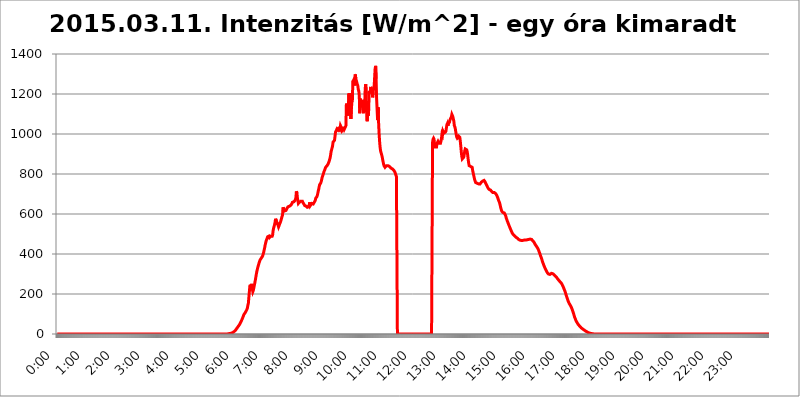
| Category | 2015.03.11. Intenzitás [W/m^2] - egy óra kimaradt |
|---|---|
| 0.0 | -0.256 |
| 0.0006944444444444445 | -0.256 |
| 0.001388888888888889 | -0.256 |
| 0.0020833333333333333 | -0.256 |
| 0.002777777777777778 | -0.256 |
| 0.003472222222222222 | -0.256 |
| 0.004166666666666667 | -0.256 |
| 0.004861111111111111 | -0.256 |
| 0.005555555555555556 | -0.256 |
| 0.0062499999999999995 | -0.256 |
| 0.006944444444444444 | -0.256 |
| 0.007638888888888889 | -0.256 |
| 0.008333333333333333 | -0.256 |
| 0.009027777777777779 | -0.256 |
| 0.009722222222222222 | -0.256 |
| 0.010416666666666666 | -0.256 |
| 0.011111111111111112 | -0.256 |
| 0.011805555555555555 | -0.256 |
| 0.012499999999999999 | -0.256 |
| 0.013194444444444444 | -0.256 |
| 0.013888888888888888 | -0.256 |
| 0.014583333333333332 | -0.256 |
| 0.015277777777777777 | -0.256 |
| 0.015972222222222224 | -0.256 |
| 0.016666666666666666 | -0.256 |
| 0.017361111111111112 | -0.256 |
| 0.018055555555555557 | -0.256 |
| 0.01875 | -0.256 |
| 0.019444444444444445 | -0.256 |
| 0.02013888888888889 | -0.256 |
| 0.020833333333333332 | -0.256 |
| 0.02152777777777778 | -0.256 |
| 0.022222222222222223 | -0.256 |
| 0.02291666666666667 | -0.256 |
| 0.02361111111111111 | -0.256 |
| 0.024305555555555556 | -0.256 |
| 0.024999999999999998 | -0.256 |
| 0.025694444444444447 | -0.256 |
| 0.02638888888888889 | -0.256 |
| 0.027083333333333334 | -0.256 |
| 0.027777777777777776 | -0.256 |
| 0.02847222222222222 | -0.256 |
| 0.029166666666666664 | -0.256 |
| 0.029861111111111113 | -0.256 |
| 0.030555555555555555 | -0.256 |
| 0.03125 | -0.256 |
| 0.03194444444444445 | -0.256 |
| 0.03263888888888889 | -0.256 |
| 0.03333333333333333 | -0.256 |
| 0.034027777777777775 | -0.256 |
| 0.034722222222222224 | -0.256 |
| 0.035416666666666666 | -0.256 |
| 0.036111111111111115 | -0.256 |
| 0.03680555555555556 | -0.256 |
| 0.0375 | -0.256 |
| 0.03819444444444444 | -0.256 |
| 0.03888888888888889 | -0.256 |
| 0.03958333333333333 | -0.256 |
| 0.04027777777777778 | -0.256 |
| 0.04097222222222222 | -0.256 |
| 0.041666666666666664 | -0.256 |
| 0.042361111111111106 | -0.256 |
| 0.04305555555555556 | -0.256 |
| 0.043750000000000004 | -0.256 |
| 0.044444444444444446 | -0.256 |
| 0.04513888888888889 | -0.256 |
| 0.04583333333333334 | -0.256 |
| 0.04652777777777778 | -0.256 |
| 0.04722222222222222 | -0.256 |
| 0.04791666666666666 | -0.256 |
| 0.04861111111111111 | -0.256 |
| 0.049305555555555554 | -0.256 |
| 0.049999999999999996 | -0.256 |
| 0.05069444444444445 | -0.256 |
| 0.051388888888888894 | -0.256 |
| 0.052083333333333336 | -0.256 |
| 0.05277777777777778 | -0.256 |
| 0.05347222222222222 | -0.256 |
| 0.05416666666666667 | -0.256 |
| 0.05486111111111111 | -0.256 |
| 0.05555555555555555 | -0.256 |
| 0.05625 | -0.256 |
| 0.05694444444444444 | -0.256 |
| 0.057638888888888885 | -0.256 |
| 0.05833333333333333 | -0.256 |
| 0.05902777777777778 | -0.256 |
| 0.059722222222222225 | -0.256 |
| 0.06041666666666667 | -0.256 |
| 0.061111111111111116 | -0.256 |
| 0.06180555555555556 | -0.256 |
| 0.0625 | -0.256 |
| 0.06319444444444444 | -0.256 |
| 0.06388888888888888 | -0.256 |
| 0.06458333333333334 | -0.256 |
| 0.06527777777777778 | -0.256 |
| 0.06597222222222222 | -0.256 |
| 0.06666666666666667 | -0.256 |
| 0.06736111111111111 | -0.256 |
| 0.06805555555555555 | -0.256 |
| 0.06874999999999999 | -0.256 |
| 0.06944444444444443 | -0.256 |
| 0.07013888888888889 | -0.256 |
| 0.07083333333333333 | -0.256 |
| 0.07152777777777779 | -0.256 |
| 0.07222222222222223 | -0.256 |
| 0.07291666666666667 | -0.256 |
| 0.07361111111111111 | -0.256 |
| 0.07430555555555556 | -0.256 |
| 0.075 | -0.256 |
| 0.07569444444444444 | -0.256 |
| 0.0763888888888889 | -0.256 |
| 0.07708333333333334 | -0.256 |
| 0.07777777777777778 | -0.256 |
| 0.07847222222222222 | -0.256 |
| 0.07916666666666666 | -0.256 |
| 0.0798611111111111 | -0.256 |
| 0.08055555555555556 | -0.256 |
| 0.08125 | -0.256 |
| 0.08194444444444444 | -0.256 |
| 0.08263888888888889 | -0.256 |
| 0.08333333333333333 | -0.256 |
| 0.08402777777777777 | -0.256 |
| 0.08472222222222221 | -0.256 |
| 0.08541666666666665 | -0.256 |
| 0.08611111111111112 | -0.256 |
| 0.08680555555555557 | -0.256 |
| 0.08750000000000001 | -0.256 |
| 0.08819444444444445 | -0.256 |
| 0.08888888888888889 | -0.256 |
| 0.08958333333333333 | -0.256 |
| 0.09027777777777778 | -0.256 |
| 0.09097222222222222 | -0.256 |
| 0.09166666666666667 | -0.256 |
| 0.09236111111111112 | -0.256 |
| 0.09305555555555556 | -0.256 |
| 0.09375 | -0.256 |
| 0.09444444444444444 | -0.256 |
| 0.09513888888888888 | -0.256 |
| 0.09583333333333333 | -0.256 |
| 0.09652777777777777 | -0.256 |
| 0.09722222222222222 | -0.256 |
| 0.09791666666666667 | -0.256 |
| 0.09861111111111111 | -0.256 |
| 0.09930555555555555 | -0.256 |
| 0.09999999999999999 | -0.256 |
| 0.10069444444444443 | -0.256 |
| 0.1013888888888889 | -0.256 |
| 0.10208333333333335 | -0.256 |
| 0.10277777777777779 | -0.256 |
| 0.10347222222222223 | -0.256 |
| 0.10416666666666667 | -0.256 |
| 0.10486111111111111 | -0.256 |
| 0.10555555555555556 | -0.256 |
| 0.10625 | -0.256 |
| 0.10694444444444444 | -0.256 |
| 0.1076388888888889 | -0.256 |
| 0.10833333333333334 | -0.256 |
| 0.10902777777777778 | -0.256 |
| 0.10972222222222222 | -0.256 |
| 0.1111111111111111 | -0.256 |
| 0.11180555555555556 | -0.256 |
| 0.11180555555555556 | -0.256 |
| 0.1125 | -0.256 |
| 0.11319444444444444 | -0.256 |
| 0.11388888888888889 | -0.256 |
| 0.11458333333333333 | -0.256 |
| 0.11527777777777777 | -0.256 |
| 0.11597222222222221 | -0.256 |
| 0.11666666666666665 | -0.256 |
| 0.1173611111111111 | -0.256 |
| 0.11805555555555557 | -0.256 |
| 0.11944444444444445 | -0.256 |
| 0.12013888888888889 | -0.256 |
| 0.12083333333333333 | -0.256 |
| 0.12152777777777778 | -0.256 |
| 0.12222222222222223 | -0.256 |
| 0.12291666666666667 | -0.256 |
| 0.12291666666666667 | -0.256 |
| 0.12361111111111112 | -0.256 |
| 0.12430555555555556 | -0.256 |
| 0.125 | -0.256 |
| 0.12569444444444444 | -0.256 |
| 0.12638888888888888 | -0.256 |
| 0.12708333333333333 | -0.256 |
| 0.16875 | -0.256 |
| 0.12847222222222224 | -0.256 |
| 0.12916666666666668 | -0.256 |
| 0.12986111111111112 | -0.256 |
| 0.13055555555555556 | -0.256 |
| 0.13125 | -0.256 |
| 0.13194444444444445 | -0.256 |
| 0.1326388888888889 | -0.256 |
| 0.13333333333333333 | -0.256 |
| 0.13402777777777777 | -0.256 |
| 0.13402777777777777 | -0.256 |
| 0.13472222222222222 | -0.256 |
| 0.13541666666666666 | -0.256 |
| 0.1361111111111111 | -0.256 |
| 0.13749999999999998 | -0.256 |
| 0.13819444444444443 | -0.256 |
| 0.1388888888888889 | -0.256 |
| 0.13958333333333334 | -0.256 |
| 0.14027777777777778 | -0.256 |
| 0.14097222222222222 | -0.256 |
| 0.14166666666666666 | -0.256 |
| 0.1423611111111111 | -0.256 |
| 0.14305555555555557 | -0.256 |
| 0.14375000000000002 | -0.256 |
| 0.14444444444444446 | -0.256 |
| 0.1451388888888889 | -0.256 |
| 0.1451388888888889 | -0.256 |
| 0.14652777777777778 | -0.256 |
| 0.14722222222222223 | -0.256 |
| 0.14791666666666667 | -0.256 |
| 0.1486111111111111 | -0.256 |
| 0.14930555555555555 | -0.256 |
| 0.15 | -0.256 |
| 0.15069444444444444 | -0.256 |
| 0.15138888888888888 | -0.256 |
| 0.15208333333333332 | -0.256 |
| 0.15277777777777776 | -0.256 |
| 0.15347222222222223 | -0.256 |
| 0.15416666666666667 | -0.256 |
| 0.15486111111111112 | -0.256 |
| 0.15555555555555556 | -0.256 |
| 0.15625 | -0.256 |
| 0.15694444444444444 | -0.256 |
| 0.15763888888888888 | -0.256 |
| 0.15833333333333333 | -0.256 |
| 0.15902777777777777 | -0.256 |
| 0.15972222222222224 | -0.256 |
| 0.16041666666666668 | -0.256 |
| 0.16111111111111112 | -0.256 |
| 0.16180555555555556 | -0.256 |
| 0.1625 | -0.256 |
| 0.16319444444444445 | -0.256 |
| 0.1638888888888889 | -0.256 |
| 0.16458333333333333 | -0.256 |
| 0.16527777777777777 | -0.256 |
| 0.16597222222222222 | -0.256 |
| 0.16666666666666666 | -0.256 |
| 0.1673611111111111 | -0.256 |
| 0.16805555555555554 | -0.256 |
| 0.16874999999999998 | -0.256 |
| 0.16944444444444443 | -0.256 |
| 0.17013888888888887 | -0.256 |
| 0.1708333333333333 | -0.256 |
| 0.17152777777777775 | -0.256 |
| 0.17222222222222225 | -0.256 |
| 0.1729166666666667 | -0.256 |
| 0.17361111111111113 | -0.256 |
| 0.17430555555555557 | -0.256 |
| 0.17500000000000002 | -0.256 |
| 0.17569444444444446 | -0.256 |
| 0.1763888888888889 | -0.256 |
| 0.17708333333333334 | -0.256 |
| 0.17777777777777778 | -0.256 |
| 0.17847222222222223 | -0.256 |
| 0.17916666666666667 | -0.256 |
| 0.1798611111111111 | -0.256 |
| 0.18055555555555555 | -0.256 |
| 0.18125 | -0.256 |
| 0.18194444444444444 | -0.256 |
| 0.1826388888888889 | -0.256 |
| 0.18333333333333335 | -0.256 |
| 0.1840277777777778 | -0.256 |
| 0.18472222222222223 | -0.256 |
| 0.18541666666666667 | -0.256 |
| 0.18611111111111112 | -0.256 |
| 0.18680555555555556 | -0.256 |
| 0.1875 | -0.256 |
| 0.18819444444444444 | -0.256 |
| 0.18888888888888888 | -0.256 |
| 0.18958333333333333 | -0.256 |
| 0.19027777777777777 | -0.256 |
| 0.1909722222222222 | -0.256 |
| 0.19166666666666665 | -0.256 |
| 0.19236111111111112 | -0.256 |
| 0.19305555555555554 | -0.256 |
| 0.19375 | -0.256 |
| 0.19444444444444445 | -0.256 |
| 0.1951388888888889 | -0.256 |
| 0.19583333333333333 | -0.256 |
| 0.19652777777777777 | -0.256 |
| 0.19722222222222222 | -0.256 |
| 0.19791666666666666 | -0.256 |
| 0.1986111111111111 | -0.256 |
| 0.19930555555555554 | -0.256 |
| 0.19999999999999998 | -0.256 |
| 0.20069444444444443 | -0.256 |
| 0.20138888888888887 | -0.256 |
| 0.2020833333333333 | -0.256 |
| 0.2027777777777778 | -0.256 |
| 0.2034722222222222 | -0.256 |
| 0.2041666666666667 | -0.256 |
| 0.20486111111111113 | -0.256 |
| 0.20555555555555557 | -0.256 |
| 0.20625000000000002 | -0.256 |
| 0.20694444444444446 | -0.256 |
| 0.2076388888888889 | -0.256 |
| 0.20833333333333334 | -0.256 |
| 0.20902777777777778 | -0.256 |
| 0.20972222222222223 | -0.256 |
| 0.21041666666666667 | -0.256 |
| 0.2111111111111111 | -0.256 |
| 0.21180555555555555 | -0.256 |
| 0.2125 | -0.256 |
| 0.21319444444444444 | -0.256 |
| 0.2138888888888889 | -0.256 |
| 0.21458333333333335 | -0.256 |
| 0.2152777777777778 | -0.256 |
| 0.21597222222222223 | -0.256 |
| 0.21666666666666667 | -0.256 |
| 0.21736111111111112 | -0.256 |
| 0.21805555555555556 | -0.256 |
| 0.21875 | -0.256 |
| 0.21944444444444444 | -0.256 |
| 0.22013888888888888 | -0.256 |
| 0.22083333333333333 | -0.256 |
| 0.22152777777777777 | -0.256 |
| 0.2222222222222222 | -0.256 |
| 0.22291666666666665 | -0.256 |
| 0.2236111111111111 | -0.256 |
| 0.22430555555555556 | -0.256 |
| 0.225 | -0.256 |
| 0.22569444444444445 | -0.256 |
| 0.2263888888888889 | -0.256 |
| 0.22708333333333333 | -0.256 |
| 0.22777777777777777 | -0.256 |
| 0.22847222222222222 | -0.256 |
| 0.22916666666666666 | -0.256 |
| 0.2298611111111111 | -0.256 |
| 0.23055555555555554 | -0.256 |
| 0.23124999999999998 | -0.256 |
| 0.23194444444444443 | -0.256 |
| 0.23263888888888887 | -0.256 |
| 0.2333333333333333 | -0.256 |
| 0.2340277777777778 | -0.256 |
| 0.2347222222222222 | -0.256 |
| 0.2354166666666667 | -0.256 |
| 0.23611111111111113 | -0.256 |
| 0.23680555555555557 | -0.256 |
| 0.23750000000000002 | -0.256 |
| 0.23819444444444446 | -0.256 |
| 0.2388888888888889 | -0.256 |
| 0.23958333333333334 | 1.09 |
| 0.24027777777777778 | 1.09 |
| 0.24097222222222223 | 1.09 |
| 0.24166666666666667 | 2.439 |
| 0.2423611111111111 | 2.439 |
| 0.24305555555555555 | 3.791 |
| 0.24375 | 3.791 |
| 0.24444444444444446 | 5.146 |
| 0.24513888888888888 | 6.503 |
| 0.24583333333333335 | 6.503 |
| 0.2465277777777778 | 7.862 |
| 0.24722222222222223 | 9.225 |
| 0.24791666666666667 | 11.956 |
| 0.24861111111111112 | 13.325 |
| 0.24930555555555556 | 16.069 |
| 0.25 | 18.822 |
| 0.25069444444444444 | 22.965 |
| 0.2513888888888889 | 25.736 |
| 0.2520833333333333 | 29.905 |
| 0.25277777777777777 | 32.691 |
| 0.2534722222222222 | 35.483 |
| 0.25416666666666665 | 39.68 |
| 0.2548611111111111 | 42.483 |
| 0.2555555555555556 | 46.695 |
| 0.25625000000000003 | 50.914 |
| 0.2569444444444445 | 56.548 |
| 0.2576388888888889 | 60.778 |
| 0.25833333333333336 | 66.423 |
| 0.2590277777777778 | 72.069 |
| 0.25972222222222224 | 77.715 |
| 0.2604166666666667 | 84.766 |
| 0.2611111111111111 | 90.399 |
| 0.26180555555555557 | 97.427 |
| 0.2625 | 101.634 |
| 0.26319444444444445 | 104.435 |
| 0.2638888888888889 | 108.629 |
| 0.26458333333333334 | 112.814 |
| 0.2652777777777778 | 116.989 |
| 0.2659722222222222 | 122.538 |
| 0.26666666666666666 | 129.444 |
| 0.2673611111111111 | 143.144 |
| 0.26805555555555555 | 153.986 |
| 0.26875 | 183.184 |
| 0.26944444444444443 | 211.405 |
| 0.2701388888888889 | 239.868 |
| 0.2708333333333333 | 245.925 |
| 0.27152777777777776 | 223.906 |
| 0.2722222222222222 | 242.296 |
| 0.27291666666666664 | 250.739 |
| 0.2736111111111111 | 225.146 |
| 0.2743055555555555 | 211.405 |
| 0.27499999999999997 | 217.681 |
| 0.27569444444444446 | 230.083 |
| 0.27638888888888885 | 242.296 |
| 0.27708333333333335 | 255.528 |
| 0.2777777777777778 | 268.576 |
| 0.27847222222222223 | 283.803 |
| 0.2791666666666667 | 297.728 |
| 0.2798611111111111 | 311.594 |
| 0.28055555555555556 | 321.998 |
| 0.28125 | 332.443 |
| 0.28194444444444444 | 341.794 |
| 0.2826388888888889 | 350.049 |
| 0.2833333333333333 | 358.394 |
| 0.28402777777777777 | 365.635 |
| 0.2847222222222222 | 371.742 |
| 0.28541666666666665 | 375.442 |
| 0.28611111111111115 | 379.171 |
| 0.28680555555555554 | 382.93 |
| 0.28750000000000003 | 386.723 |
| 0.2881944444444445 | 391.834 |
| 0.2888888888888889 | 400.943 |
| 0.28958333333333336 | 408.934 |
| 0.2902777777777778 | 421.278 |
| 0.29097222222222224 | 432.656 |
| 0.2916666666666667 | 445.971 |
| 0.2923611111111111 | 456.747 |
| 0.29305555555555557 | 466.302 |
| 0.29375 | 472.848 |
| 0.29444444444444445 | 479.541 |
| 0.2951388888888889 | 486.389 |
| 0.29583333333333334 | 488.126 |
| 0.2965277777777778 | 489.873 |
| 0.2972222222222222 | 489.873 |
| 0.29791666666666666 | 482.945 |
| 0.2986111111111111 | 481.238 |
| 0.29930555555555555 | 488.126 |
| 0.3 | 491.63 |
| 0.30069444444444443 | 488.126 |
| 0.3013888888888889 | 488.126 |
| 0.3020833333333333 | 495.176 |
| 0.30277777777777776 | 517.375 |
| 0.3034722222222222 | 529.108 |
| 0.30416666666666664 | 531.108 |
| 0.3048611111111111 | 547.572 |
| 0.3055555555555555 | 560.495 |
| 0.30624999999999997 | 576.233 |
| 0.3069444444444444 | 564.917 |
| 0.3076388888888889 | 547.572 |
| 0.30833333333333335 | 556.131 |
| 0.3090277777777778 | 553.97 |
| 0.30972222222222223 | 543.376 |
| 0.3104166666666667 | 535.145 |
| 0.3111111111111111 | 541.298 |
| 0.31180555555555556 | 549.691 |
| 0.3125 | 553.97 |
| 0.31319444444444444 | 560.495 |
| 0.3138888888888889 | 569.398 |
| 0.3145833333333333 | 578.542 |
| 0.31527777777777777 | 587.934 |
| 0.3159722222222222 | 595.145 |
| 0.31666666666666665 | 633.495 |
| 0.31736111111111115 | 636.194 |
| 0.31805555555555554 | 620.273 |
| 0.31875000000000003 | 615.11 |
| 0.3194444444444445 | 612.554 |
| 0.3201388888888889 | 615.11 |
| 0.32083333333333336 | 617.682 |
| 0.3215277777777778 | 622.881 |
| 0.32222222222222224 | 628.152 |
| 0.3229166666666667 | 630.814 |
| 0.3236111111111111 | 636.194 |
| 0.32430555555555557 | 638.912 |
| 0.325 | 638.912 |
| 0.32569444444444445 | 638.912 |
| 0.3263888888888889 | 641.649 |
| 0.32708333333333334 | 641.649 |
| 0.3277777777777778 | 644.405 |
| 0.3284722222222222 | 647.179 |
| 0.32916666666666666 | 652.786 |
| 0.3298611111111111 | 658.471 |
| 0.33055555555555555 | 661.343 |
| 0.33125 | 661.343 |
| 0.33194444444444443 | 661.343 |
| 0.3326388888888889 | 664.234 |
| 0.3333333333333333 | 667.146 |
| 0.3340277777777778 | 673.03 |
| 0.3347222222222222 | 682.011 |
| 0.3354166666666667 | 713.328 |
| 0.3361111111111111 | 706.89 |
| 0.3368055555555556 | 682.011 |
| 0.33749999999999997 | 667.146 |
| 0.33819444444444446 | 652.786 |
| 0.33888888888888885 | 655.618 |
| 0.33958333333333335 | 658.471 |
| 0.34027777777777773 | 658.471 |
| 0.34097222222222223 | 661.343 |
| 0.3416666666666666 | 664.234 |
| 0.3423611111111111 | 664.234 |
| 0.3430555555555555 | 664.234 |
| 0.34375 | 664.234 |
| 0.3444444444444445 | 658.471 |
| 0.3451388888888889 | 655.618 |
| 0.3458333333333334 | 649.973 |
| 0.34652777777777777 | 647.179 |
| 0.34722222222222227 | 641.649 |
| 0.34791666666666665 | 638.912 |
| 0.34861111111111115 | 638.912 |
| 0.34930555555555554 | 638.912 |
| 0.35000000000000003 | 636.194 |
| 0.3506944444444444 | 633.495 |
| 0.3513888888888889 | 633.495 |
| 0.3520833333333333 | 633.495 |
| 0.3527777777777778 | 636.194 |
| 0.3534722222222222 | 636.194 |
| 0.3541666666666667 | 658.471 |
| 0.3548611111111111 | 641.649 |
| 0.35555555555555557 | 644.405 |
| 0.35625 | 644.405 |
| 0.35694444444444445 | 652.786 |
| 0.3576388888888889 | 652.786 |
| 0.35833333333333334 | 649.973 |
| 0.3590277777777778 | 649.973 |
| 0.3597222222222222 | 649.973 |
| 0.36041666666666666 | 658.471 |
| 0.3611111111111111 | 658.471 |
| 0.36180555555555555 | 667.146 |
| 0.3625 | 678.997 |
| 0.36319444444444443 | 678.997 |
| 0.3638888888888889 | 685.046 |
| 0.3645833333333333 | 691.18 |
| 0.3652777777777778 | 700.54 |
| 0.3659722222222222 | 713.328 |
| 0.3666666666666667 | 723.153 |
| 0.3673611111111111 | 736.574 |
| 0.3680555555555556 | 746.886 |
| 0.36874999999999997 | 750.371 |
| 0.36944444444444446 | 753.881 |
| 0.37013888888888885 | 760.972 |
| 0.37083333333333335 | 771.794 |
| 0.37152777777777773 | 782.842 |
| 0.37222222222222223 | 790.334 |
| 0.3729166666666666 | 794.119 |
| 0.3736111111111111 | 805.632 |
| 0.3743055555555555 | 813.439 |
| 0.375 | 817.382 |
| 0.3756944444444445 | 825.351 |
| 0.3763888888888889 | 833.43 |
| 0.3770833333333334 | 837.51 |
| 0.37777777777777777 | 837.51 |
| 0.37847222222222227 | 841.619 |
| 0.37916666666666665 | 841.619 |
| 0.37986111111111115 | 849.92 |
| 0.38055555555555554 | 849.92 |
| 0.38125000000000003 | 862.585 |
| 0.3819444444444444 | 866.865 |
| 0.3826388888888889 | 879.878 |
| 0.3833333333333333 | 893.157 |
| 0.3840277777777778 | 911.285 |
| 0.3847222222222222 | 920.533 |
| 0.3854166666666667 | 929.905 |
| 0.3861111111111111 | 939.404 |
| 0.38680555555555557 | 958.785 |
| 0.3875 | 963.712 |
| 0.38819444444444445 | 963.712 |
| 0.3888888888888889 | 968.671 |
| 0.38958333333333334 | 988.839 |
| 0.3902777777777778 | 1009.546 |
| 0.3909722222222222 | 1014.809 |
| 0.39166666666666666 | 1014.809 |
| 0.3923611111111111 | 1025.437 |
| 0.39305555555555555 | 1025.437 |
| 0.39375 | 1020.106 |
| 0.39444444444444443 | 1025.437 |
| 0.3951388888888889 | 1025.437 |
| 0.3958333333333333 | 1020.106 |
| 0.3965277777777778 | 1025.437 |
| 0.3972222222222222 | 1041.644 |
| 0.3979166666666667 | 1036.206 |
| 0.3986111111111111 | 1036.206 |
| 0.3993055555555556 | 1014.809 |
| 0.39999999999999997 | 1014.809 |
| 0.40069444444444446 | 1020.106 |
| 0.40138888888888885 | 1025.437 |
| 0.40208333333333335 | 1036.206 |
| 0.40277777777777773 | 1025.437 |
| 0.40347222222222223 | 1025.437 |
| 0.4041666666666666 | 1036.206 |
| 0.4048611111111111 | 1041.644 |
| 0.4055555555555555 | 1151.928 |
| 0.40625 | 1121.587 |
| 0.4069444444444445 | 1145.782 |
| 0.4076388888888889 | 1092.203 |
| 0.4083333333333334 | 1133.607 |
| 0.40902777777777777 | 1202.523 |
| 0.40972222222222227 | 1133.607 |
| 0.41041666666666665 | 1202.523 |
| 0.41111111111111115 | 1121.587 |
| 0.41180555555555554 | 1075.021 |
| 0.41250000000000003 | 1121.587 |
| 0.4131944444444444 | 1158.113 |
| 0.4138888888888889 | 1164.337 |
| 0.4145833333333333 | 1262.571 |
| 0.4152777777777778 | 1262.571 |
| 0.4159722222222222 | 1262.571 |
| 0.4166666666666667 | 1276.38 |
| 0.4173611111111111 | 1242.179 |
| 0.41805555555555557 | 1297.416 |
| 0.41875 | 1276.38 |
| 0.41944444444444445 | 1276.38 |
| 0.4201388888888889 | 1276.38 |
| 0.42083333333333334 | 1248.934 |
| 0.4215277777777778 | 1242.179 |
| 0.4222222222222222 | 1222.164 |
| 0.42291666666666666 | 1215.576 |
| 0.4236111111111111 | 1189.633 |
| 0.42430555555555555 | 1103.843 |
| 0.425 | 1176.905 |
| 0.42569444444444443 | 1133.607 |
| 0.4263888888888889 | 1145.782 |
| 0.4270833333333333 | 1139.675 |
| 0.4277777777777778 | 1170.601 |
| 0.4284722222222222 | 1151.928 |
| 0.4291666666666667 | 1115.634 |
| 0.4298611111111111 | 1103.843 |
| 0.4305555555555556 | 1139.675 |
| 0.43124999999999997 | 1151.928 |
| 0.43194444444444446 | 1228.794 |
| 0.43263888888888885 | 1248.934 |
| 0.43333333333333335 | 1202.523 |
| 0.43402777777777773 | 1092.203 |
| 0.43472222222222223 | 1063.751 |
| 0.4354166666666666 | 1115.634 |
| 0.4361111111111111 | 1092.203 |
| 0.4368055555555555 | 1121.587 |
| 0.4375 | 1215.576 |
| 0.4381944444444445 | 1209.029 |
| 0.4388888888888889 | 1202.523 |
| 0.4395833333333334 | 1235.465 |
| 0.44027777777777777 | 1209.029 |
| 0.44097222222222227 | 1215.576 |
| 0.44166666666666665 | 1202.523 |
| 0.44236111111111115 | 1183.249 |
| 0.44305555555555554 | 1209.029 |
| 0.44375000000000003 | 1228.794 |
| 0.4444444444444444 | 1235.465 |
| 0.4451388888888889 | 1283.348 |
| 0.4458333333333333 | 1326.076 |
| 0.4465277777777778 | 1340.673 |
| 0.4472222222222222 | 1276.38 |
| 0.4479166666666667 | 1176.905 |
| 0.4486111111111111 | 1176.905 |
| 0.44930555555555557 | 1069.368 |
| 0.45 | 1133.607 |
| 0.45069444444444445 | 1058.17 |
| 0.4513888888888889 | 1004.318 |
| 0.45208333333333334 | 963.712 |
| 0.4527777777777778 | 934.639 |
| 0.4534722222222222 | 915.893 |
| 0.45416666666666666 | 906.707 |
| 0.4548611111111111 | 897.643 |
| 0.45555555555555555 | 888.701 |
| 0.45625 | 875.511 |
| 0.45694444444444443 | 862.585 |
| 0.4576388888888889 | 849.92 |
| 0.4583333333333333 | 841.619 |
| 0.4590277777777778 | 837.51 |
| 0.4597222222222222 | 833.43 |
| 0.4604166666666667 | 837.51 |
| 0.4611111111111111 | 837.51 |
| 0.4618055555555556 | 841.619 |
| 0.46249999999999997 | 841.619 |
| 0.46319444444444446 | 841.619 |
| 0.46388888888888885 | 841.619 |
| 0.46458333333333335 | 841.619 |
| 0.46527777777777773 | 841.619 |
| 0.46597222222222223 | 837.51 |
| 0.4666666666666666 | 837.51 |
| 0.4673611111111111 | 833.43 |
| 0.4680555555555555 | 829.377 |
| 0.46875 | 825.351 |
| 0.4694444444444445 | 825.351 |
| 0.4701388888888889 | 825.351 |
| 0.4708333333333334 | 821.353 |
| 0.47152777777777777 | 821.353 |
| 0.47222222222222227 | 817.382 |
| 0.47291666666666665 | 813.439 |
| 0.47361111111111115 | 809.522 |
| 0.47430555555555554 | 801.768 |
| 0.47500000000000003 | 794.119 |
| 0.4756944444444444 | 786.575 |
| 0.4763888888888889 | 786.575 |
| 0.4770833333333333 | -0.256 |
| 0.4777777777777778 | -0.256 |
| 0.4784722222222222 | -0.256 |
| 0.4791666666666667 | -0.256 |
| 0.4798611111111111 | -0.256 |
| 0.48055555555555557 | -0.256 |
| 0.48125 | -0.256 |
| 0.48194444444444445 | -0.256 |
| 0.4826388888888889 | -0.256 |
| 0.48333333333333334 | -0.256 |
| 0.4840277777777778 | -0.256 |
| 0.4847222222222222 | -0.256 |
| 0.48541666666666666 | -0.256 |
| 0.4861111111111111 | -0.256 |
| 0.48680555555555555 | -0.256 |
| 0.4875 | -0.256 |
| 0.48819444444444443 | -0.256 |
| 0.4888888888888889 | -0.256 |
| 0.4895833333333333 | -0.256 |
| 0.4902777777777778 | -0.256 |
| 0.4909722222222222 | -0.256 |
| 0.4916666666666667 | -0.256 |
| 0.4923611111111111 | -0.256 |
| 0.4930555555555556 | -0.256 |
| 0.49374999999999997 | -0.256 |
| 0.49444444444444446 | -0.256 |
| 0.49513888888888885 | -0.256 |
| 0.49583333333333335 | -0.256 |
| 0.49652777777777773 | -0.256 |
| 0.49722222222222223 | -0.256 |
| 0.4979166666666666 | -0.256 |
| 0.4986111111111111 | -0.256 |
| 0.4993055555555555 | -0.256 |
| 0.5 | -0.256 |
| 0.5006944444444444 | -0.256 |
| 0.5013888888888889 | -0.256 |
| 0.5020833333333333 | -0.256 |
| 0.5027777777777778 | -0.256 |
| 0.5034722222222222 | -0.256 |
| 0.5041666666666667 | -0.256 |
| 0.5048611111111111 | -0.256 |
| 0.5055555555555555 | -0.256 |
| 0.50625 | -0.256 |
| 0.5069444444444444 | -0.256 |
| 0.5076388888888889 | -0.256 |
| 0.5083333333333333 | -0.256 |
| 0.5090277777777777 | -0.256 |
| 0.5097222222222222 | -0.256 |
| 0.5104166666666666 | -0.256 |
| 0.5111111111111112 | -0.256 |
| 0.5118055555555555 | -0.256 |
| 0.5125000000000001 | -0.256 |
| 0.5131944444444444 | -0.256 |
| 0.513888888888889 | -0.256 |
| 0.5145833333333333 | -0.256 |
| 0.5152777777777778 | -0.256 |
| 0.5159722222222222 | -0.256 |
| 0.5166666666666667 | -0.256 |
| 0.517361111111111 | -0.256 |
| 0.5180555555555556 | -0.256 |
| 0.5187499999999999 | -0.256 |
| 0.5194444444444445 | -0.256 |
| 0.5201388888888888 | -0.256 |
| 0.5208333333333334 | -0.256 |
| 0.5215277777777778 | -0.256 |
| 0.5222222222222223 | -0.256 |
| 0.5229166666666667 | -0.256 |
| 0.5236111111111111 | -0.256 |
| 0.5243055555555556 | -0.256 |
| 0.525 | -0.256 |
| 0.5256944444444445 | -0.256 |
| 0.5263888888888889 | 958.785 |
| 0.5270833333333333 | 973.663 |
| 0.5277777777777778 | 978.688 |
| 0.5284722222222222 | 973.663 |
| 0.5291666666666667 | 949.03 |
| 0.5298611111111111 | 934.639 |
| 0.5305555555555556 | 929.905 |
| 0.53125 | 929.905 |
| 0.5319444444444444 | 934.639 |
| 0.5326388888888889 | 953.892 |
| 0.5333333333333333 | 953.892 |
| 0.5340277777777778 | 963.712 |
| 0.5347222222222222 | 958.785 |
| 0.5354166666666667 | 953.892 |
| 0.5361111111111111 | 949.03 |
| 0.5368055555555555 | 953.892 |
| 0.5375 | 953.892 |
| 0.5381944444444444 | 963.712 |
| 0.5388888888888889 | 978.688 |
| 0.5395833333333333 | 999.125 |
| 0.5402777777777777 | 993.965 |
| 0.5409722222222222 | 1014.809 |
| 0.5416666666666666 | 1014.809 |
| 0.5423611111111112 | 1004.318 |
| 0.5430555555555555 | 1004.318 |
| 0.5437500000000001 | 1004.318 |
| 0.5444444444444444 | 1009.546 |
| 0.545138888888889 | 1014.809 |
| 0.5458333333333333 | 1030.804 |
| 0.5465277777777778 | 1047.117 |
| 0.5472222222222222 | 1052.625 |
| 0.5479166666666667 | 1041.644 |
| 0.548611111111111 | 1052.625 |
| 0.5493055555555556 | 1052.625 |
| 0.5499999999999999 | 1058.17 |
| 0.5506944444444445 | 1069.368 |
| 0.5513888888888888 | 1075.021 |
| 0.5520833333333334 | 1075.021 |
| 0.5527777777777778 | 1086.439 |
| 0.5534722222222223 | 1098.004 |
| 0.5541666666666667 | 1092.203 |
| 0.5548611111111111 | 1086.439 |
| 0.5555555555555556 | 1075.021 |
| 0.55625 | 1063.751 |
| 0.5569444444444445 | 1041.644 |
| 0.5576388888888889 | 1036.206 |
| 0.5583333333333333 | 1025.437 |
| 0.5590277777777778 | 1009.546 |
| 0.5597222222222222 | 993.965 |
| 0.5604166666666667 | 983.747 |
| 0.5611111111111111 | 978.688 |
| 0.5618055555555556 | 978.688 |
| 0.5625 | 983.747 |
| 0.5631944444444444 | 988.839 |
| 0.5638888888888889 | 988.839 |
| 0.5645833333333333 | 983.747 |
| 0.5652777777777778 | 963.712 |
| 0.5659722222222222 | 939.404 |
| 0.5666666666666667 | 911.285 |
| 0.5673611111111111 | 888.701 |
| 0.5680555555555555 | 875.511 |
| 0.56875 | 871.173 |
| 0.5694444444444444 | 871.173 |
| 0.5701388888888889 | 884.274 |
| 0.5708333333333333 | 897.643 |
| 0.5715277777777777 | 915.893 |
| 0.5722222222222222 | 925.203 |
| 0.5729166666666666 | 929.905 |
| 0.5736111111111112 | 925.203 |
| 0.5743055555555555 | 920.533 |
| 0.5750000000000001 | 911.285 |
| 0.5756944444444444 | 893.157 |
| 0.576388888888889 | 871.173 |
| 0.5770833333333333 | 854.113 |
| 0.5777777777777778 | 841.619 |
| 0.5784722222222222 | 841.619 |
| 0.5791666666666667 | 837.51 |
| 0.579861111111111 | 837.51 |
| 0.5805555555555556 | 841.619 |
| 0.5812499999999999 | 841.619 |
| 0.5819444444444445 | 833.43 |
| 0.5826388888888888 | 817.382 |
| 0.5833333333333334 | 805.632 |
| 0.5840277777777778 | 794.119 |
| 0.5847222222222223 | 782.842 |
| 0.5854166666666667 | 771.794 |
| 0.5861111111111111 | 764.555 |
| 0.5868055555555556 | 757.414 |
| 0.5875 | 753.881 |
| 0.5881944444444445 | 753.881 |
| 0.5888888888888889 | 753.881 |
| 0.5895833333333333 | 750.371 |
| 0.5902777777777778 | 750.371 |
| 0.5909722222222222 | 750.371 |
| 0.5916666666666667 | 750.371 |
| 0.5923611111111111 | 750.371 |
| 0.5930555555555556 | 750.371 |
| 0.59375 | 753.881 |
| 0.5944444444444444 | 757.414 |
| 0.5951388888888889 | 757.414 |
| 0.5958333333333333 | 760.972 |
| 0.5965277777777778 | 764.555 |
| 0.5972222222222222 | 768.162 |
| 0.5979166666666667 | 768.162 |
| 0.5986111111111111 | 768.162 |
| 0.5993055555555555 | 764.555 |
| 0.6 | 760.972 |
| 0.6006944444444444 | 757.414 |
| 0.6013888888888889 | 750.371 |
| 0.6020833333333333 | 746.886 |
| 0.6027777777777777 | 739.988 |
| 0.6034722222222222 | 736.574 |
| 0.6041666666666666 | 729.817 |
| 0.6048611111111112 | 726.474 |
| 0.6055555555555555 | 723.153 |
| 0.6062500000000001 | 723.153 |
| 0.6069444444444444 | 719.855 |
| 0.607638888888889 | 719.855 |
| 0.6083333333333333 | 716.58 |
| 0.6090277777777778 | 713.328 |
| 0.6097222222222222 | 713.328 |
| 0.6104166666666667 | 710.098 |
| 0.611111111111111 | 706.89 |
| 0.6118055555555556 | 706.89 |
| 0.6124999999999999 | 706.89 |
| 0.6131944444444445 | 706.89 |
| 0.6138888888888888 | 706.89 |
| 0.6145833333333334 | 703.704 |
| 0.6152777777777778 | 700.54 |
| 0.6159722222222223 | 697.399 |
| 0.6166666666666667 | 691.18 |
| 0.6173611111111111 | 685.046 |
| 0.6180555555555556 | 678.997 |
| 0.61875 | 670.078 |
| 0.6194444444444445 | 664.234 |
| 0.6201388888888889 | 658.471 |
| 0.6208333333333333 | 649.973 |
| 0.6215277777777778 | 638.912 |
| 0.6222222222222222 | 628.152 |
| 0.6229166666666667 | 620.273 |
| 0.6236111111111111 | 612.554 |
| 0.6243055555555556 | 610.016 |
| 0.625 | 607.495 |
| 0.6256944444444444 | 607.495 |
| 0.6263888888888889 | 607.495 |
| 0.6270833333333333 | 604.992 |
| 0.6277777777777778 | 602.505 |
| 0.6284722222222222 | 595.145 |
| 0.6291666666666667 | 587.934 |
| 0.6298611111111111 | 578.542 |
| 0.6305555555555555 | 571.661 |
| 0.63125 | 564.917 |
| 0.6319444444444444 | 558.305 |
| 0.6326388888888889 | 551.823 |
| 0.6333333333333333 | 545.467 |
| 0.6340277777777777 | 539.234 |
| 0.6347222222222222 | 533.12 |
| 0.6354166666666666 | 527.122 |
| 0.6361111111111112 | 521.237 |
| 0.6368055555555555 | 515.462 |
| 0.6375000000000001 | 509.793 |
| 0.6381944444444444 | 504.229 |
| 0.638888888888889 | 500.575 |
| 0.6395833333333333 | 496.965 |
| 0.6402777777777778 | 495.176 |
| 0.6409722222222222 | 493.398 |
| 0.6416666666666667 | 489.873 |
| 0.642361111111111 | 488.126 |
| 0.6430555555555556 | 484.662 |
| 0.6437499999999999 | 482.945 |
| 0.6444444444444445 | 481.238 |
| 0.6451388888888888 | 479.541 |
| 0.6458333333333334 | 476.176 |
| 0.6465277777777778 | 474.507 |
| 0.6472222222222223 | 472.848 |
| 0.6479166666666667 | 471.198 |
| 0.6486111111111111 | 469.557 |
| 0.6493055555555556 | 469.557 |
| 0.65 | 467.925 |
| 0.6506944444444445 | 467.925 |
| 0.6513888888888889 | 467.925 |
| 0.6520833333333333 | 467.925 |
| 0.6527777777777778 | 467.925 |
| 0.6534722222222222 | 469.557 |
| 0.6541666666666667 | 469.557 |
| 0.6548611111111111 | 469.557 |
| 0.6555555555555556 | 469.557 |
| 0.65625 | 469.557 |
| 0.6569444444444444 | 469.557 |
| 0.6576388888888889 | 471.198 |
| 0.6583333333333333 | 471.198 |
| 0.6590277777777778 | 471.198 |
| 0.6597222222222222 | 471.198 |
| 0.6604166666666667 | 472.848 |
| 0.6611111111111111 | 472.848 |
| 0.6618055555555555 | 472.848 |
| 0.6625 | 474.507 |
| 0.6631944444444444 | 474.507 |
| 0.6638888888888889 | 476.176 |
| 0.6645833333333333 | 474.507 |
| 0.6652777777777777 | 472.848 |
| 0.6659722222222222 | 471.198 |
| 0.6666666666666666 | 469.557 |
| 0.6673611111111111 | 464.688 |
| 0.6680555555555556 | 461.486 |
| 0.6687500000000001 | 458.318 |
| 0.6694444444444444 | 453.629 |
| 0.6701388888888888 | 449.011 |
| 0.6708333333333334 | 445.971 |
| 0.6715277777777778 | 441.469 |
| 0.6722222222222222 | 438.503 |
| 0.6729166666666666 | 434.107 |
| 0.6736111111111112 | 429.773 |
| 0.6743055555555556 | 425.497 |
| 0.6749999999999999 | 419.883 |
| 0.6756944444444444 | 412.998 |
| 0.6763888888888889 | 406.25 |
| 0.6770833333333334 | 399.628 |
| 0.6777777777777777 | 391.834 |
| 0.6784722222222223 | 385.455 |
| 0.6791666666666667 | 377.925 |
| 0.6798611111111111 | 370.515 |
| 0.6805555555555555 | 362.004 |
| 0.68125 | 354.805 |
| 0.6819444444444445 | 348.865 |
| 0.6826388888888889 | 341.794 |
| 0.6833333333333332 | 335.941 |
| 0.6840277777777778 | 330.117 |
| 0.6847222222222222 | 324.314 |
| 0.6854166666666667 | 319.683 |
| 0.686111111111111 | 315.059 |
| 0.6868055555555556 | 310.439 |
| 0.6875 | 305.819 |
| 0.6881944444444444 | 302.353 |
| 0.688888888888889 | 300.041 |
| 0.6895833333333333 | 297.728 |
| 0.6902777777777778 | 297.728 |
| 0.6909722222222222 | 297.728 |
| 0.6916666666666668 | 300.041 |
| 0.6923611111111111 | 302.353 |
| 0.6930555555555555 | 303.509 |
| 0.69375 | 303.509 |
| 0.6944444444444445 | 302.353 |
| 0.6951388888888889 | 301.198 |
| 0.6958333333333333 | 300.041 |
| 0.6965277777777777 | 297.728 |
| 0.6972222222222223 | 294.255 |
| 0.6979166666666666 | 291.937 |
| 0.6986111111111111 | 289.616 |
| 0.6993055555555556 | 287.293 |
| 0.7000000000000001 | 284.967 |
| 0.7006944444444444 | 281.471 |
| 0.7013888888888888 | 277.967 |
| 0.7020833333333334 | 274.454 |
| 0.7027777777777778 | 272.106 |
| 0.7034722222222222 | 268.576 |
| 0.7041666666666666 | 266.216 |
| 0.7048611111111112 | 262.666 |
| 0.7055555555555556 | 260.293 |
| 0.7062499999999999 | 257.913 |
| 0.7069444444444444 | 254.333 |
| 0.7076388888888889 | 250.739 |
| 0.7083333333333334 | 245.925 |
| 0.7090277777777777 | 241.083 |
| 0.7097222222222223 | 234.99 |
| 0.7104166666666667 | 228.852 |
| 0.7111111111111111 | 222.665 |
| 0.7118055555555555 | 216.43 |
| 0.7125 | 208.881 |
| 0.7131944444444445 | 201.258 |
| 0.7138888888888889 | 193.561 |
| 0.7145833333333332 | 185.79 |
| 0.7152777777777778 | 177.946 |
| 0.7159722222222222 | 171.353 |
| 0.7166666666666667 | 163.378 |
| 0.717361111111111 | 158.022 |
| 0.7180555555555556 | 152.637 |
| 0.71875 | 148.579 |
| 0.7194444444444444 | 144.506 |
| 0.720138888888889 | 140.417 |
| 0.7208333333333333 | 134.943 |
| 0.7215277777777778 | 129.444 |
| 0.7222222222222222 | 122.538 |
| 0.7229166666666668 | 115.598 |
| 0.7236111111111111 | 108.629 |
| 0.7243055555555555 | 100.233 |
| 0.725 | 91.806 |
| 0.7256944444444445 | 83.356 |
| 0.7263888888888889 | 77.715 |
| 0.7270833333333333 | 70.658 |
| 0.7277777777777777 | 65.012 |
| 0.7284722222222223 | 60.778 |
| 0.7291666666666666 | 56.548 |
| 0.7298611111111111 | 52.322 |
| 0.7305555555555556 | 48.1 |
| 0.7312500000000001 | 45.29 |
| 0.7319444444444444 | 42.483 |
| 0.7326388888888888 | 39.68 |
| 0.7333333333333334 | 36.881 |
| 0.7340277777777778 | 34.086 |
| 0.7347222222222222 | 31.297 |
| 0.7354166666666666 | 28.514 |
| 0.7361111111111112 | 27.124 |
| 0.7368055555555556 | 25.736 |
| 0.7374999999999999 | 22.965 |
| 0.7381944444444444 | 21.582 |
| 0.7388888888888889 | 20.201 |
| 0.7395833333333334 | 17.444 |
| 0.7402777777777777 | 16.069 |
| 0.7409722222222223 | 14.696 |
| 0.7416666666666667 | 13.325 |
| 0.7423611111111111 | 11.956 |
| 0.7430555555555555 | 10.589 |
| 0.74375 | 9.225 |
| 0.7444444444444445 | 7.862 |
| 0.7451388888888889 | 6.503 |
| 0.7458333333333332 | 5.146 |
| 0.7465277777777778 | 5.146 |
| 0.7472222222222222 | 3.791 |
| 0.7479166666666667 | 3.791 |
| 0.748611111111111 | 2.439 |
| 0.7493055555555556 | 2.439 |
| 0.75 | 1.09 |
| 0.7506944444444444 | 1.09 |
| 0.751388888888889 | 1.09 |
| 0.7520833333333333 | -0.256 |
| 0.7527777777777778 | -0.256 |
| 0.7534722222222222 | -0.256 |
| 0.7541666666666668 | -0.256 |
| 0.7548611111111111 | -0.256 |
| 0.7555555555555555 | -0.256 |
| 0.75625 | -0.256 |
| 0.7569444444444445 | -0.256 |
| 0.7576388888888889 | -0.256 |
| 0.7583333333333333 | -0.256 |
| 0.7590277777777777 | -0.256 |
| 0.7597222222222223 | -0.256 |
| 0.7604166666666666 | -0.256 |
| 0.7611111111111111 | -0.256 |
| 0.7618055555555556 | -0.256 |
| 0.7625000000000001 | -0.256 |
| 0.7631944444444444 | -0.256 |
| 0.7638888888888888 | -0.256 |
| 0.7645833333333334 | -0.256 |
| 0.7652777777777778 | -0.256 |
| 0.7659722222222222 | -0.256 |
| 0.7666666666666666 | -0.256 |
| 0.7673611111111112 | -0.256 |
| 0.7680555555555556 | -0.256 |
| 0.7687499999999999 | -0.256 |
| 0.7694444444444444 | -0.256 |
| 0.7701388888888889 | -0.256 |
| 0.7708333333333334 | -0.256 |
| 0.7715277777777777 | -0.256 |
| 0.7722222222222223 | -0.256 |
| 0.7729166666666667 | -0.256 |
| 0.7736111111111111 | -0.256 |
| 0.7743055555555555 | -0.256 |
| 0.775 | -0.256 |
| 0.7756944444444445 | -0.256 |
| 0.7763888888888889 | -0.256 |
| 0.7770833333333332 | -0.256 |
| 0.7777777777777778 | -0.256 |
| 0.7784722222222222 | -0.256 |
| 0.7791666666666667 | -0.256 |
| 0.779861111111111 | -0.256 |
| 0.7805555555555556 | -0.256 |
| 0.78125 | -0.256 |
| 0.7819444444444444 | -0.256 |
| 0.782638888888889 | -0.256 |
| 0.7833333333333333 | -0.256 |
| 0.7840277777777778 | -0.256 |
| 0.7847222222222222 | -0.256 |
| 0.7854166666666668 | -0.256 |
| 0.7861111111111111 | -0.256 |
| 0.7868055555555555 | -0.256 |
| 0.7875 | -0.256 |
| 0.7881944444444445 | -0.256 |
| 0.7888888888888889 | -0.256 |
| 0.7895833333333333 | -0.256 |
| 0.7902777777777777 | -0.256 |
| 0.7909722222222223 | -0.256 |
| 0.7916666666666666 | -0.256 |
| 0.7923611111111111 | -0.256 |
| 0.7930555555555556 | -0.256 |
| 0.7937500000000001 | -0.256 |
| 0.7944444444444444 | -0.256 |
| 0.7951388888888888 | -0.256 |
| 0.7958333333333334 | -0.256 |
| 0.7965277777777778 | -0.256 |
| 0.7972222222222222 | -0.256 |
| 0.7979166666666666 | -0.256 |
| 0.7986111111111112 | -0.256 |
| 0.7993055555555556 | -0.256 |
| 0.7999999999999999 | -0.256 |
| 0.8006944444444444 | -0.256 |
| 0.8013888888888889 | -0.256 |
| 0.8020833333333334 | -0.256 |
| 0.8027777777777777 | -0.256 |
| 0.8034722222222223 | -0.256 |
| 0.8041666666666667 | -0.256 |
| 0.8048611111111111 | -0.256 |
| 0.8055555555555555 | -0.256 |
| 0.80625 | -0.256 |
| 0.8069444444444445 | -0.256 |
| 0.8076388888888889 | -0.256 |
| 0.8083333333333332 | -0.256 |
| 0.8090277777777778 | -0.256 |
| 0.8097222222222222 | -0.256 |
| 0.8104166666666667 | -0.256 |
| 0.811111111111111 | -0.256 |
| 0.8118055555555556 | -0.256 |
| 0.8125 | -0.256 |
| 0.8131944444444444 | -0.256 |
| 0.813888888888889 | -0.256 |
| 0.8145833333333333 | -0.256 |
| 0.8152777777777778 | -0.256 |
| 0.8159722222222222 | -0.256 |
| 0.8166666666666668 | -0.256 |
| 0.8173611111111111 | -0.256 |
| 0.8180555555555555 | -0.256 |
| 0.81875 | -0.256 |
| 0.8194444444444445 | -0.256 |
| 0.8201388888888889 | -0.256 |
| 0.8208333333333333 | -0.256 |
| 0.8215277777777777 | -0.256 |
| 0.8222222222222223 | -0.256 |
| 0.8229166666666666 | -0.256 |
| 0.8236111111111111 | -0.256 |
| 0.8243055555555556 | -0.256 |
| 0.8250000000000001 | -0.256 |
| 0.8256944444444444 | -0.256 |
| 0.8263888888888888 | -0.256 |
| 0.8270833333333334 | -0.256 |
| 0.8277777777777778 | -0.256 |
| 0.8284722222222222 | -0.256 |
| 0.8291666666666666 | -0.256 |
| 0.8298611111111112 | -0.256 |
| 0.8305555555555556 | -0.256 |
| 0.8312499999999999 | -0.256 |
| 0.8319444444444444 | -0.256 |
| 0.8326388888888889 | -0.256 |
| 0.8333333333333334 | -0.256 |
| 0.8340277777777777 | -0.256 |
| 0.8347222222222223 | -0.256 |
| 0.8354166666666667 | -0.256 |
| 0.8361111111111111 | -0.256 |
| 0.8368055555555555 | -0.256 |
| 0.8375 | -0.256 |
| 0.8381944444444445 | -0.256 |
| 0.8388888888888889 | -0.256 |
| 0.8395833333333332 | -0.256 |
| 0.8402777777777778 | -0.256 |
| 0.8409722222222222 | -0.256 |
| 0.8416666666666667 | -0.256 |
| 0.842361111111111 | -0.256 |
| 0.8430555555555556 | -0.256 |
| 0.84375 | -0.256 |
| 0.8444444444444444 | -0.256 |
| 0.845138888888889 | -0.256 |
| 0.8458333333333333 | -0.256 |
| 0.8465277777777778 | -0.256 |
| 0.8472222222222222 | -0.256 |
| 0.8479166666666668 | -0.256 |
| 0.8486111111111111 | -0.256 |
| 0.8493055555555555 | -0.256 |
| 0.85 | -0.256 |
| 0.8506944444444445 | -0.256 |
| 0.8513888888888889 | -0.256 |
| 0.8520833333333333 | -0.256 |
| 0.8527777777777777 | -0.256 |
| 0.8534722222222223 | -0.256 |
| 0.8541666666666666 | -0.256 |
| 0.8548611111111111 | -0.256 |
| 0.8555555555555556 | -0.256 |
| 0.8562500000000001 | -0.256 |
| 0.8569444444444444 | -0.256 |
| 0.8576388888888888 | -0.256 |
| 0.8583333333333334 | -0.256 |
| 0.8590277777777778 | -0.256 |
| 0.8597222222222222 | -0.256 |
| 0.8604166666666666 | -0.256 |
| 0.8611111111111112 | -0.256 |
| 0.8618055555555556 | -0.256 |
| 0.8624999999999999 | -0.256 |
| 0.8631944444444444 | -0.256 |
| 0.8638888888888889 | -0.256 |
| 0.8645833333333334 | -0.256 |
| 0.8652777777777777 | -0.256 |
| 0.8659722222222223 | -0.256 |
| 0.8666666666666667 | -0.256 |
| 0.8673611111111111 | -0.256 |
| 0.8680555555555555 | -0.256 |
| 0.86875 | -0.256 |
| 0.8694444444444445 | -0.256 |
| 0.8701388888888889 | -0.256 |
| 0.8708333333333332 | -0.256 |
| 0.8715277777777778 | -0.256 |
| 0.8722222222222222 | -0.256 |
| 0.8729166666666667 | -0.256 |
| 0.873611111111111 | -0.256 |
| 0.8743055555555556 | -0.256 |
| 0.875 | -0.256 |
| 0.8756944444444444 | -0.256 |
| 0.876388888888889 | -0.256 |
| 0.8770833333333333 | -0.256 |
| 0.8777777777777778 | -0.256 |
| 0.8784722222222222 | -0.256 |
| 0.8791666666666668 | -0.256 |
| 0.8798611111111111 | -0.256 |
| 0.8805555555555555 | -0.256 |
| 0.88125 | -0.256 |
| 0.8819444444444445 | -0.256 |
| 0.8826388888888889 | -0.256 |
| 0.8833333333333333 | -0.256 |
| 0.8840277777777777 | -0.256 |
| 0.8847222222222223 | -0.256 |
| 0.8854166666666666 | -0.256 |
| 0.8861111111111111 | -0.256 |
| 0.8868055555555556 | -0.256 |
| 0.8875000000000001 | -0.256 |
| 0.8881944444444444 | -0.256 |
| 0.8888888888888888 | -0.256 |
| 0.8895833333333334 | -0.256 |
| 0.8902777777777778 | -0.256 |
| 0.8909722222222222 | -0.256 |
| 0.8916666666666666 | -0.256 |
| 0.8923611111111112 | -0.256 |
| 0.8930555555555556 | -0.256 |
| 0.8937499999999999 | -0.256 |
| 0.8944444444444444 | -0.256 |
| 0.8951388888888889 | -0.256 |
| 0.8958333333333334 | -0.256 |
| 0.8965277777777777 | -0.256 |
| 0.8972222222222223 | -0.256 |
| 0.8979166666666667 | -0.256 |
| 0.8986111111111111 | -0.256 |
| 0.8993055555555555 | -0.256 |
| 0.9 | -0.256 |
| 0.9006944444444445 | -0.256 |
| 0.9013888888888889 | -0.256 |
| 0.9020833333333332 | -0.256 |
| 0.9027777777777778 | -0.256 |
| 0.9034722222222222 | -0.256 |
| 0.9041666666666667 | -0.256 |
| 0.904861111111111 | -0.256 |
| 0.9055555555555556 | -0.256 |
| 0.90625 | -0.256 |
| 0.9069444444444444 | -0.256 |
| 0.907638888888889 | -0.256 |
| 0.9083333333333333 | -0.256 |
| 0.9090277777777778 | -0.256 |
| 0.9097222222222222 | -0.256 |
| 0.9104166666666668 | -0.256 |
| 0.9111111111111111 | -0.256 |
| 0.9118055555555555 | -0.256 |
| 0.9125 | -0.256 |
| 0.9131944444444445 | -0.256 |
| 0.9138888888888889 | -0.256 |
| 0.9145833333333333 | -0.256 |
| 0.9152777777777777 | -0.256 |
| 0.9159722222222223 | -0.256 |
| 0.9166666666666666 | -0.256 |
| 0.9173611111111111 | -0.256 |
| 0.9180555555555556 | -0.256 |
| 0.9187500000000001 | -0.256 |
| 0.9194444444444444 | -0.256 |
| 0.9201388888888888 | -0.256 |
| 0.9208333333333334 | -0.256 |
| 0.9215277777777778 | -0.256 |
| 0.9222222222222222 | -0.256 |
| 0.9229166666666666 | -0.256 |
| 0.9236111111111112 | -0.256 |
| 0.9243055555555556 | -0.256 |
| 0.9249999999999999 | -0.256 |
| 0.9256944444444444 | -0.256 |
| 0.9263888888888889 | -0.256 |
| 0.9270833333333334 | -0.256 |
| 0.9277777777777777 | -0.256 |
| 0.9284722222222223 | -0.256 |
| 0.9291666666666667 | -0.256 |
| 0.9298611111111111 | -0.256 |
| 0.9305555555555555 | -0.256 |
| 0.93125 | -0.256 |
| 0.9319444444444445 | -0.256 |
| 0.9326388888888889 | -0.256 |
| 0.9333333333333332 | -0.256 |
| 0.9340277777777778 | -0.256 |
| 0.9347222222222222 | -0.256 |
| 0.9354166666666667 | -0.256 |
| 0.936111111111111 | -0.256 |
| 0.9368055555555556 | -0.256 |
| 0.9375 | -0.256 |
| 0.9381944444444444 | -0.256 |
| 0.938888888888889 | -0.256 |
| 0.9395833333333333 | -0.256 |
| 0.9402777777777778 | -0.256 |
| 0.9409722222222222 | -0.256 |
| 0.9416666666666668 | -0.256 |
| 0.9423611111111111 | -0.256 |
| 0.9430555555555555 | -0.256 |
| 0.94375 | -0.256 |
| 0.9444444444444445 | -0.256 |
| 0.9451388888888889 | -0.256 |
| 0.9458333333333333 | -0.256 |
| 0.9465277777777777 | -0.256 |
| 0.9472222222222223 | -0.256 |
| 0.9479166666666666 | -0.256 |
| 0.9486111111111111 | -0.256 |
| 0.9493055555555556 | -0.256 |
| 0.9500000000000001 | -0.256 |
| 0.9506944444444444 | -0.256 |
| 0.9513888888888888 | -0.256 |
| 0.9520833333333334 | -0.256 |
| 0.9527777777777778 | -0.256 |
| 0.9534722222222222 | -0.256 |
| 0.9541666666666666 | -0.256 |
| 0.9548611111111112 | -0.256 |
| 0.9555555555555556 | -0.256 |
| 0.9562499999999999 | -0.256 |
| 0.9569444444444444 | -0.256 |
| 0.9576388888888889 | -0.256 |
| 0.9583333333333334 | -0.256 |
| 0.9590277777777777 | -0.256 |
| 0.9597222222222223 | -0.256 |
| 0.9604166666666667 | -0.256 |
| 0.9611111111111111 | -0.256 |
| 0.9618055555555555 | -0.256 |
| 0.9625 | -0.256 |
| 0.9631944444444445 | -0.256 |
| 0.9638888888888889 | -0.256 |
| 0.9645833333333332 | -0.256 |
| 0.9652777777777778 | -0.256 |
| 0.9659722222222222 | -0.256 |
| 0.9666666666666667 | -0.256 |
| 0.967361111111111 | -0.256 |
| 0.9680555555555556 | -0.256 |
| 0.96875 | -0.256 |
| 0.9694444444444444 | -0.256 |
| 0.970138888888889 | -0.256 |
| 0.9708333333333333 | -0.256 |
| 0.9715277777777778 | -0.256 |
| 0.9722222222222222 | -0.256 |
| 0.9729166666666668 | -0.256 |
| 0.9736111111111111 | -0.256 |
| 0.9743055555555555 | -0.256 |
| 0.975 | -0.256 |
| 0.9756944444444445 | -0.256 |
| 0.9763888888888889 | -0.256 |
| 0.9770833333333333 | -0.256 |
| 0.9777777777777777 | -0.256 |
| 0.9784722222222223 | -0.256 |
| 0.9791666666666666 | -0.256 |
| 0.9798611111111111 | -0.256 |
| 0.9805555555555556 | -0.256 |
| 0.9812500000000001 | -0.256 |
| 0.9819444444444444 | -0.256 |
| 0.9826388888888888 | -0.256 |
| 0.9833333333333334 | -0.256 |
| 0.9840277777777778 | -0.256 |
| 0.9847222222222222 | -0.256 |
| 0.9854166666666666 | -0.256 |
| 0.9861111111111112 | -0.256 |
| 0.9868055555555556 | -0.256 |
| 0.9874999999999999 | -0.256 |
| 0.9881944444444444 | -0.256 |
| 0.9888888888888889 | -0.256 |
| 0.9895833333333334 | -0.256 |
| 0.9902777777777777 | -0.256 |
| 0.9909722222222223 | -0.256 |
| 0.9916666666666667 | -0.256 |
| 0.9923611111111111 | -0.256 |
| 0.9930555555555555 | -0.256 |
| 0.99375 | -0.256 |
| 0.9944444444444445 | -0.256 |
| 0.9951388888888889 | -0.256 |
| 0.9958333333333332 | -0.256 |
| 0.9965277777777778 | -0.256 |
| 0.9972222222222222 | -0.256 |
| 0.9979166666666667 | -0.256 |
| 0.998611111111111 | -0.256 |
| 0.9993055555555556 | 0 |